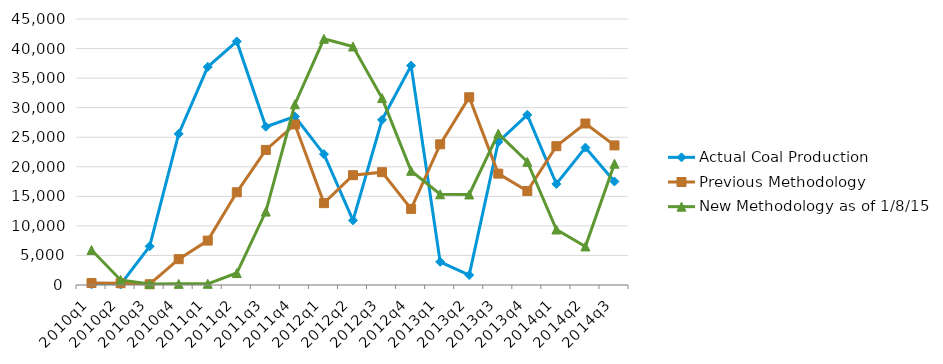
| Category | Actual Coal Production | Previous Methodology | New Methodology as of 1/8/15 |
|---|---|---|---|
| 2010q1 | 120 | 331 | 5915 |
| 2010q2 | 83 | 304 | 853 |
| 2010q3 | 6535 | 129 | 178 |
| 2010q4 | 25563 | 4370 | 191 |
| 2011q1 | 36888 | 7513 | 203 |
| 2011q2 | 41202 | 15686 | 2027 |
| 2011q3 | 26766 | 22853 | 12422 |
| 2011q4 | 28491 | 27155 | 30578 |
| 2012q1 | 22132 | 13851 | 41655 |
| 2012q2 | 10938 | 18575 | 40351 |
| 2012q3 | 27938 | 19084 | 31621 |
| 2012q4 | 37113 | 12879 | 19314 |
| 2013q1 | 3916 | 23796 | 15348 |
| 2013q2 | 1682 | 31766 | 15318 |
| 2013q3 | 24191 | 18842 | 25611 |
| 2013q4 | 28789 | 15903 | 20846 |
| 2014q1 | 17093 | 23484 | 9388 |
| 2014q2 | 23239 | 27323 | 6526 |
| 2014q3 | 17509 | 23613 | 20517 |